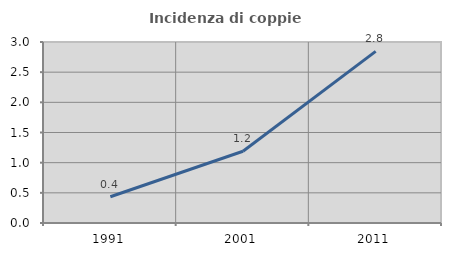
| Category | Incidenza di coppie miste |
|---|---|
| 1991.0 | 0.435 |
| 2001.0 | 1.189 |
| 2011.0 | 2.844 |